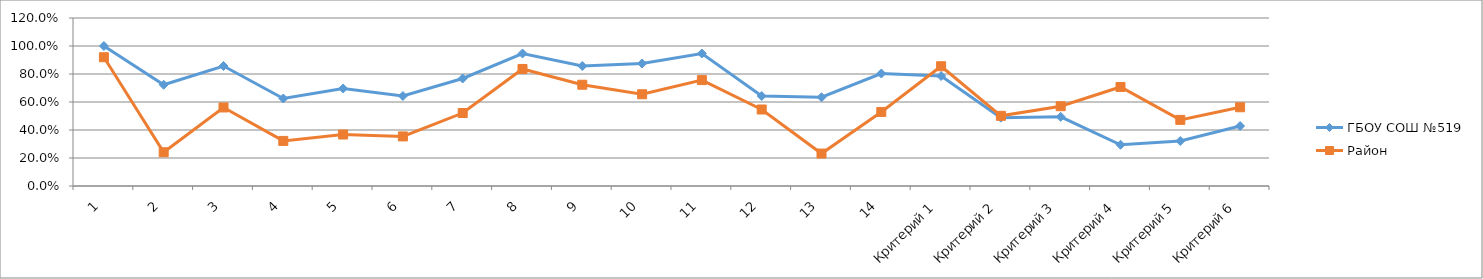
| Category | ГБОУ СОШ №519 | Район |
|---|---|---|
| 1 | 1 | 0.92 |
| 2 | 0.723 | 0.241 |
| 3 | 0.857 | 0.561 |
| 4 | 0.625 | 0.322 |
| 5 | 0.696 | 0.368 |
| 6 | 0.643 | 0.354 |
| 7 | 0.768 | 0.521 |
| 8 | 0.946 | 0.836 |
| 9 | 0.857 | 0.723 |
| 10 | 0.875 | 0.655 |
| 11 | 0.946 | 0.756 |
| 12 | 0.643 | 0.546 |
| 13 | 0.634 | 0.232 |
| 14 | 0.804 | 0.529 |
| Критерий 1 | 0.786 | 0.855 |
| Критерий 2 | 0.488 | 0.501 |
| Критерий 3 | 0.494 | 0.57 |
| Критерий 4 | 0.295 | 0.707 |
| Критерий 5 | 0.321 | 0.472 |
| Критерий 6 | 0.429 | 0.562 |